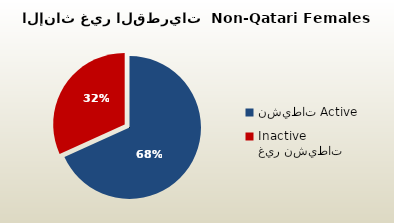
| Category | الاناث غير القطريات  Non-Qatari Females |
|---|---|
| نشيطات Active | 329019 |
| غير نشيطات Inactive | 153395 |